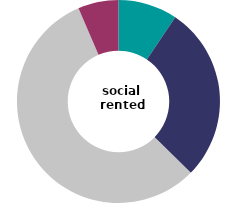
| Category | social renters |
|---|---|
| two or more bedrooms above the number required | 9.441 |
| one bedroom above the number required | 27.966 |
| room required met rooms available | 56.146 |
| overcrowded | 6.447 |